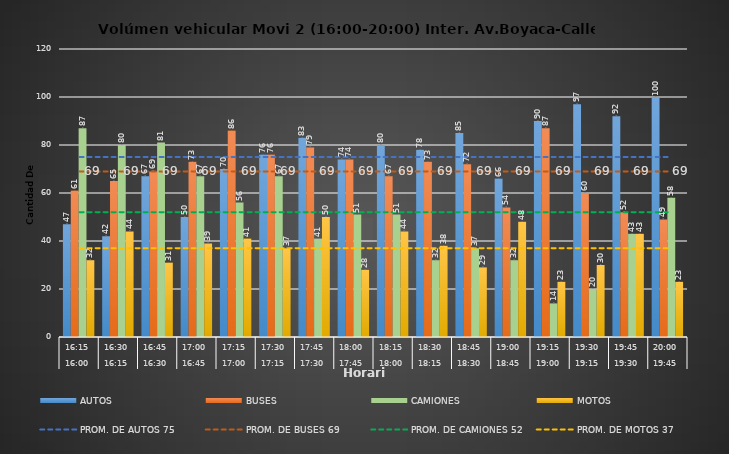
| Category | AUTOS | BUSES | CAMIONES | MOTOS |
|---|---|---|---|---|
| 0 | 47 | 61 | 87 | 32 |
| 1 | 42 | 65 | 80 | 44 |
| 2 | 67 | 69 | 81 | 31 |
| 3 | 50 | 73 | 67 | 39 |
| 4 | 70 | 86 | 56 | 41 |
| 5 | 76 | 76 | 67 | 37 |
| 6 | 83 | 79 | 41 | 50 |
| 7 | 74 | 74 | 51 | 28 |
| 8 | 80 | 67 | 51 | 44 |
| 9 | 78 | 73 | 32 | 38 |
| 10 | 85 | 72 | 37 | 29 |
| 11 | 66 | 54 | 32 | 48 |
| 12 | 90 | 87 | 14 | 23 |
| 13 | 97 | 60 | 20 | 30 |
| 14 | 92 | 52 | 43 | 43 |
| 15 | 100 | 49 | 58 | 23 |